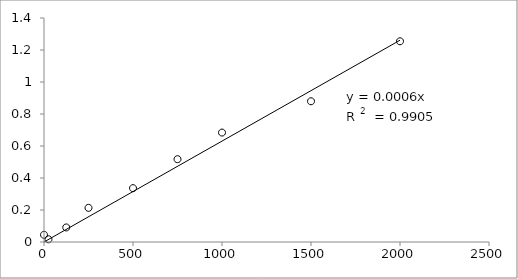
| Category | Series 0 |
|---|---|
| 2000.0 | 1.254 |
| 1500.0 | 0.88 |
| 1000.0 | 0.684 |
| 750.0 | 0.518 |
| 500.0 | 0.336 |
| 250.0 | 0.214 |
| 125.0 | 0.091 |
| 25.0 | 0.017 |
| 0.0 | 0.045 |